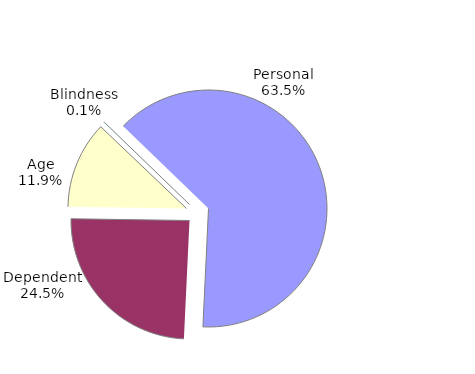
| Category | Series 0 |
|---|---|
| Personal | 5612042 |
| Dependent | 2162587 |
| Age | 1050144 |
| Blindness | 9000 |